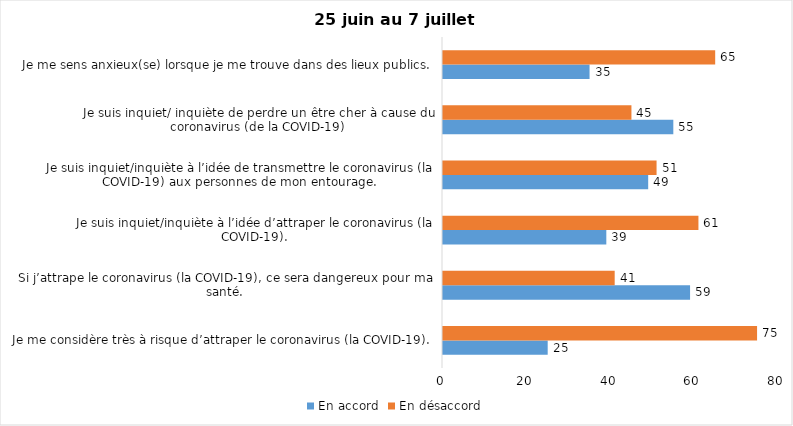
| Category | En accord | En désaccord |
|---|---|---|
| Je me considère très à risque d’attraper le coronavirus (la COVID-19). | 25 | 75 |
| Si j’attrape le coronavirus (la COVID-19), ce sera dangereux pour ma santé. | 59 | 41 |
| Je suis inquiet/inquiète à l’idée d’attraper le coronavirus (la COVID-19). | 39 | 61 |
| Je suis inquiet/inquiète à l’idée de transmettre le coronavirus (la COVID-19) aux personnes de mon entourage. | 49 | 51 |
| Je suis inquiet/ inquiète de perdre un être cher à cause du coronavirus (de la COVID-19) | 55 | 45 |
| Je me sens anxieux(se) lorsque je me trouve dans des lieux publics. | 35 | 65 |